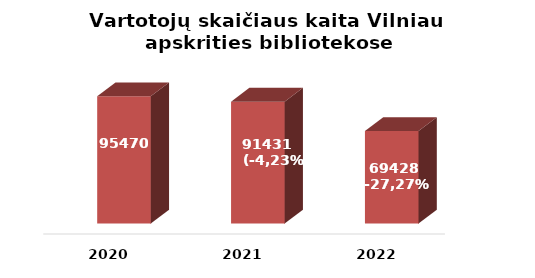
| Category | Series 0 |
|---|---|
| 2020.0 | 95470 |
| 2021.0 | 91431 |
| 2022.0 | 69428 |